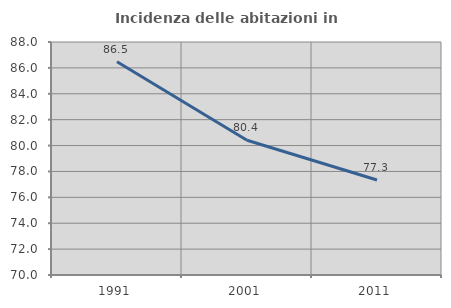
| Category | Incidenza delle abitazioni in proprietà  |
|---|---|
| 1991.0 | 86.473 |
| 2001.0 | 80.414 |
| 2011.0 | 77.336 |